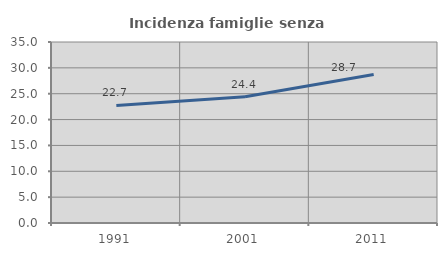
| Category | Incidenza famiglie senza nuclei |
|---|---|
| 1991.0 | 22.743 |
| 2001.0 | 24.425 |
| 2011.0 | 28.733 |